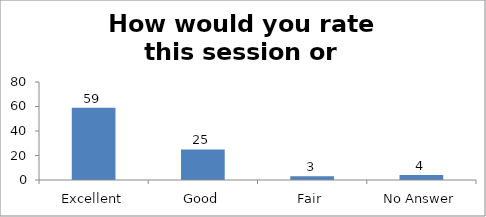
| Category | How would you rate this session or workshop? |
|---|---|
| Excellent | 59 |
| Good | 25 |
| Fair | 3 |
| No Answer | 4 |